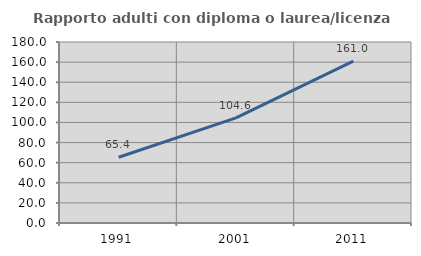
| Category | Rapporto adulti con diploma o laurea/licenza media  |
|---|---|
| 1991.0 | 65.407 |
| 2001.0 | 104.619 |
| 2011.0 | 160.982 |